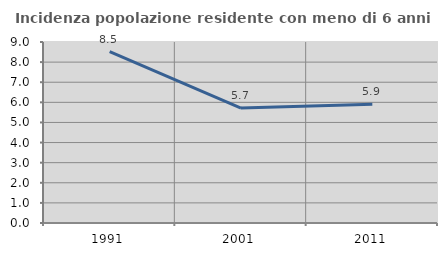
| Category | Incidenza popolazione residente con meno di 6 anni |
|---|---|
| 1991.0 | 8.521 |
| 2001.0 | 5.714 |
| 2011.0 | 5.908 |